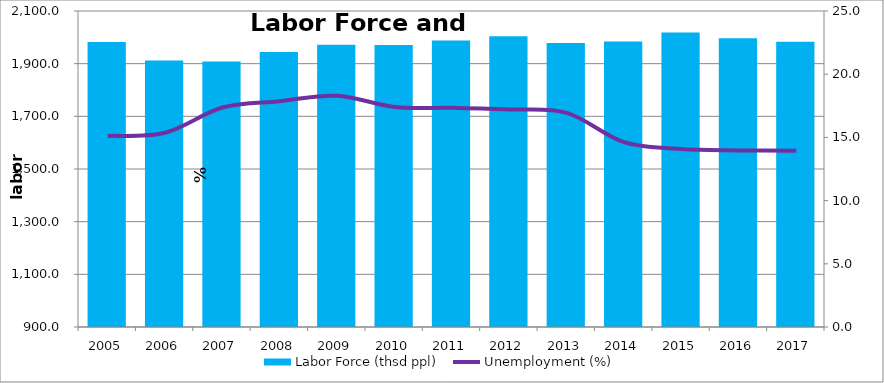
| Category | Labor Force (thsd ppl) |
|---|---|
| 2005.0 | 1982.7 |
| 2006.0 | 1911.9 |
| 2007.0 | 1908.7 |
| 2008.0 | 1944.7 |
| 2009.0 | 1971.8 |
| 2010.0 | 1970.9 |
| 2011.0 | 1988.2 |
| 2012.0 | 2004.5 |
| 2013.0 | 1978.6 |
| 2014.0 | 1984.6 |
| 2015.0 | 2018 |
| 2016.0 | 1996.2 |
| 2017.0 | 1983.1 |